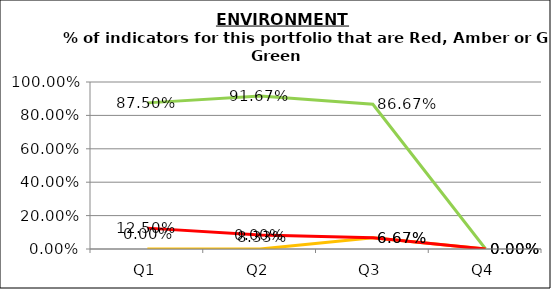
| Category | Green | Amber | Red |
|---|---|---|---|
| Q1 | 0.875 | 0 | 0.125 |
| Q2 | 0.917 | 0 | 0.083 |
| Q3 | 0.867 | 0.067 | 0.067 |
| Q4 | 0 | 0 | 0 |